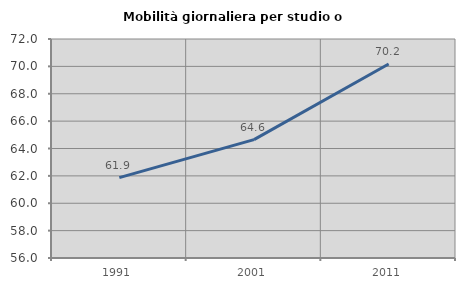
| Category | Mobilità giornaliera per studio o lavoro |
|---|---|
| 1991.0 | 61.876 |
| 2001.0 | 64.644 |
| 2011.0 | 70.171 |